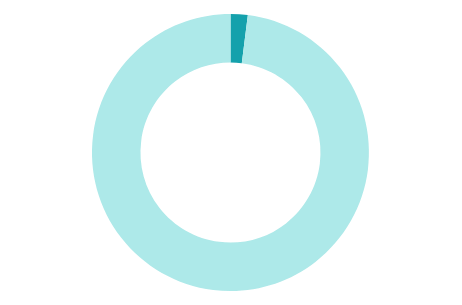
| Category | Series 0 |
|---|---|
| 0 | 2 |
| 1 | 98 |